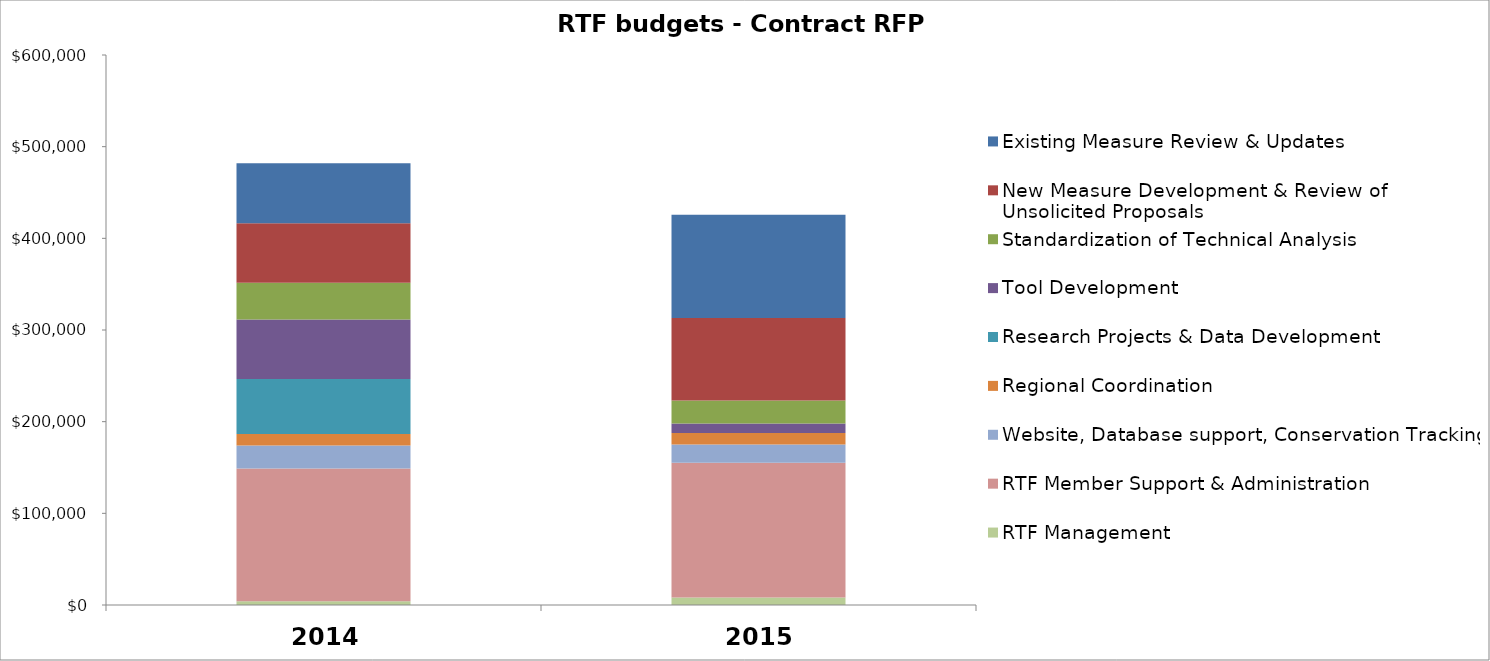
| Category | RTF Management | RTF Member Support & Administration | Website, Database support, Conservation Tracking  | Regional Coordination | Research Projects & Data Development | Tool Development | Standardization of Technical Analysis | New Measure Development & Review of Unsolicited Proposals | Existing Measure Review & Updates |
|---|---|---|---|---|---|---|---|---|---|
| 0 | 4000 | 145000 | 25000 | 12500 | 60000 | 65000 | 40000 | 65000 | 65500 |
| 1 | 8300 | 146800 | 20000 | 12500 | 0 | 10500 | 25000 | 90000 | 112500 |